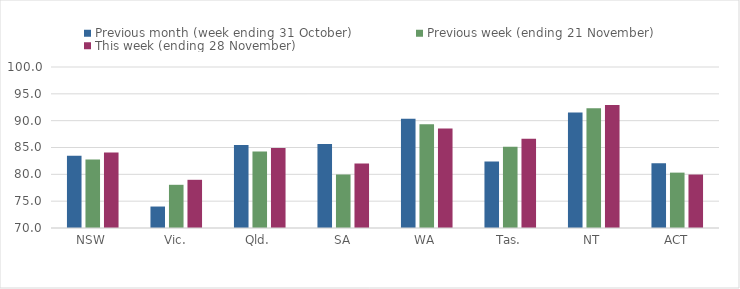
| Category | Previous month (week ending 31 October) | Previous week (ending 21 November) | This week (ending 28 November) |
|---|---|---|---|
| NSW | 83.45 | 82.77 | 84.05 |
| Vic. | 74 | 78.05 | 78.98 |
| Qld. | 85.45 | 84.27 | 84.93 |
| SA | 85.64 | 79.97 | 82.02 |
| WA | 90.35 | 89.34 | 88.54 |
| Tas. | 82.37 | 85.14 | 86.64 |
| NT | 91.52 | 92.32 | 92.92 |
| ACT | 82.08 | 80.32 | 79.96 |